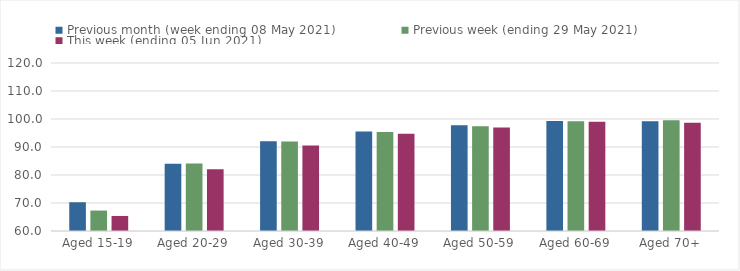
| Category | Previous month (week ending 08 May 2021) | Previous week (ending 29 May 2021) | This week (ending 05 Jun 2021) |
|---|---|---|---|
| Aged 15-19 | 70.27 | 67.3 | 65.37 |
| Aged 20-29 | 84.06 | 84.1 | 82.09 |
| Aged 30-39 | 92.03 | 91.99 | 90.54 |
| Aged 40-49 | 95.52 | 95.38 | 94.71 |
| Aged 50-59 | 97.76 | 97.41 | 97 |
| Aged 60-69 | 99.3 | 99.24 | 98.98 |
| Aged 70+ | 99.17 | 99.53 | 98.63 |